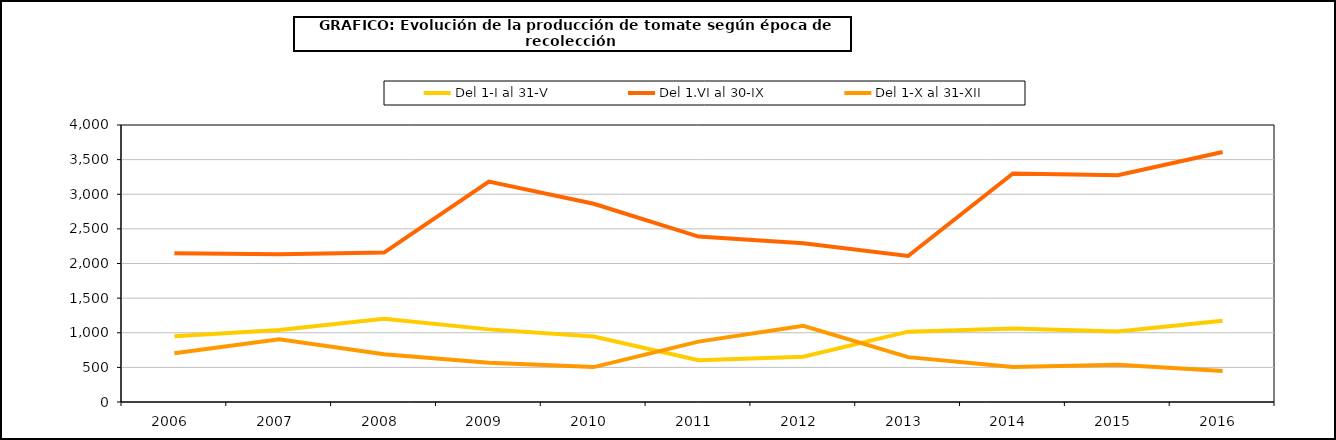
| Category | Del 1-I al 31-V | Del 1.VI al 30-IX | Del 1-X al 31-XII |
|---|---|---|---|
| 2006.0 | 947.775 | 2147.386 | 705.391 |
| 2007.0 | 1039.137 | 2134.825 | 907.515 |
| 2008.0 | 1201.903 | 2157.063 | 690.787 |
| 2009.0 | 1048.651 | 3182.545 | 566.857 |
| 2010.0 | 946.174 | 2862.288 | 504.247 |
| 2011.0 | 603.266 | 2389.177 | 871.679 |
| 2012.0 | 652.744 | 2292.602 | 1101.067 |
| 2013.0 | 1015.956 | 2108.99 | 647.9 |
| 2014.0 | 1061.306 | 3300.096 | 504.058 |
| 2015.0 | 1017.886 | 3275.48 | 539.334 |
| 2016.0 | 1174.446 | 3611.158 | 447.938 |